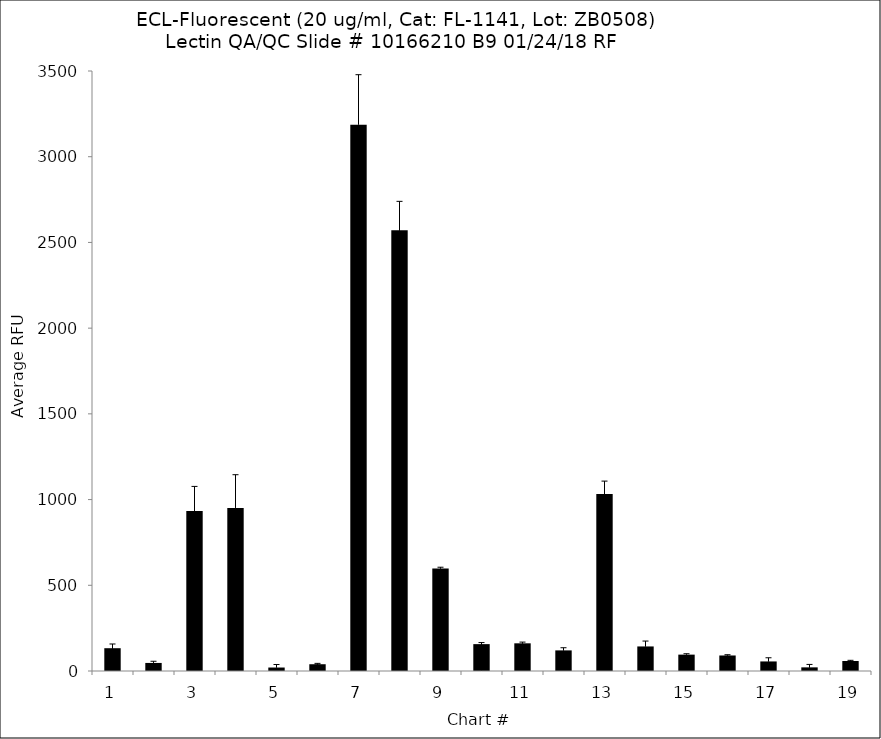
| Category | Series 0 |
|---|---|
| 1.0 | 133 |
| 2.0 | 47 |
| 3.0 | 933.5 |
| 4.0 | 951.25 |
| 5.0 | 20.25 |
| 6.0 | 39.5 |
| 7.0 | 3186.5 |
| 8.0 | 2570.75 |
| 9.0 | 597.25 |
| 10.0 | 156.75 |
| 11.0 | 161.5 |
| 12.0 | 120.25 |
| 13.0 | 1032.25 |
| 14.0 | 143.25 |
| 15.0 | 95.5 |
| 16.0 | 90.5 |
| 17.0 | 55.75 |
| 18.0 | 21.25 |
| 19.0 | 58.25 |